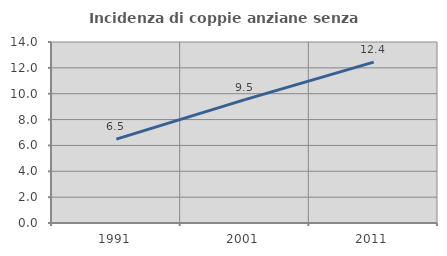
| Category | Incidenza di coppie anziane senza figli  |
|---|---|
| 1991.0 | 6.488 |
| 2001.0 | 9.543 |
| 2011.0 | 12.444 |